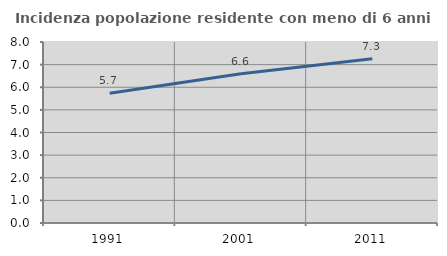
| Category | Incidenza popolazione residente con meno di 6 anni |
|---|---|
| 1991.0 | 5.734 |
| 2001.0 | 6.594 |
| 2011.0 | 7.258 |